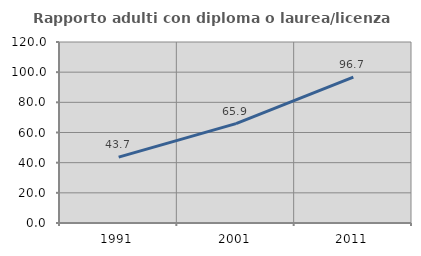
| Category | Rapporto adulti con diploma o laurea/licenza media  |
|---|---|
| 1991.0 | 43.651 |
| 2001.0 | 65.868 |
| 2011.0 | 96.711 |